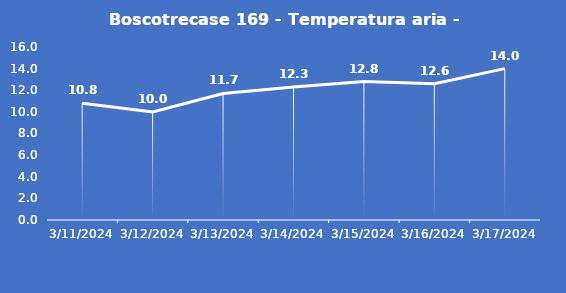
| Category | Boscotrecase 169 - Temperatura aria - Grezzo (°C) |
|---|---|
| 3/11/24 | 10.8 |
| 3/12/24 | 10 |
| 3/13/24 | 11.7 |
| 3/14/24 | 12.3 |
| 3/15/24 | 12.8 |
| 3/16/24 | 12.6 |
| 3/17/24 | 14 |